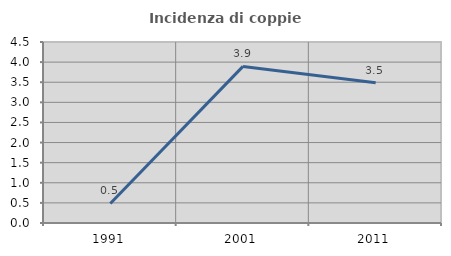
| Category | Incidenza di coppie miste |
|---|---|
| 1991.0 | 0.485 |
| 2001.0 | 3.893 |
| 2011.0 | 3.485 |